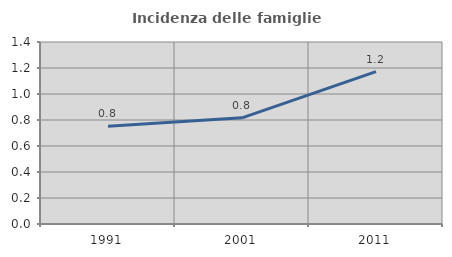
| Category | Incidenza delle famiglie numerose |
|---|---|
| 1991.0 | 0.753 |
| 2001.0 | 0.817 |
| 2011.0 | 1.172 |